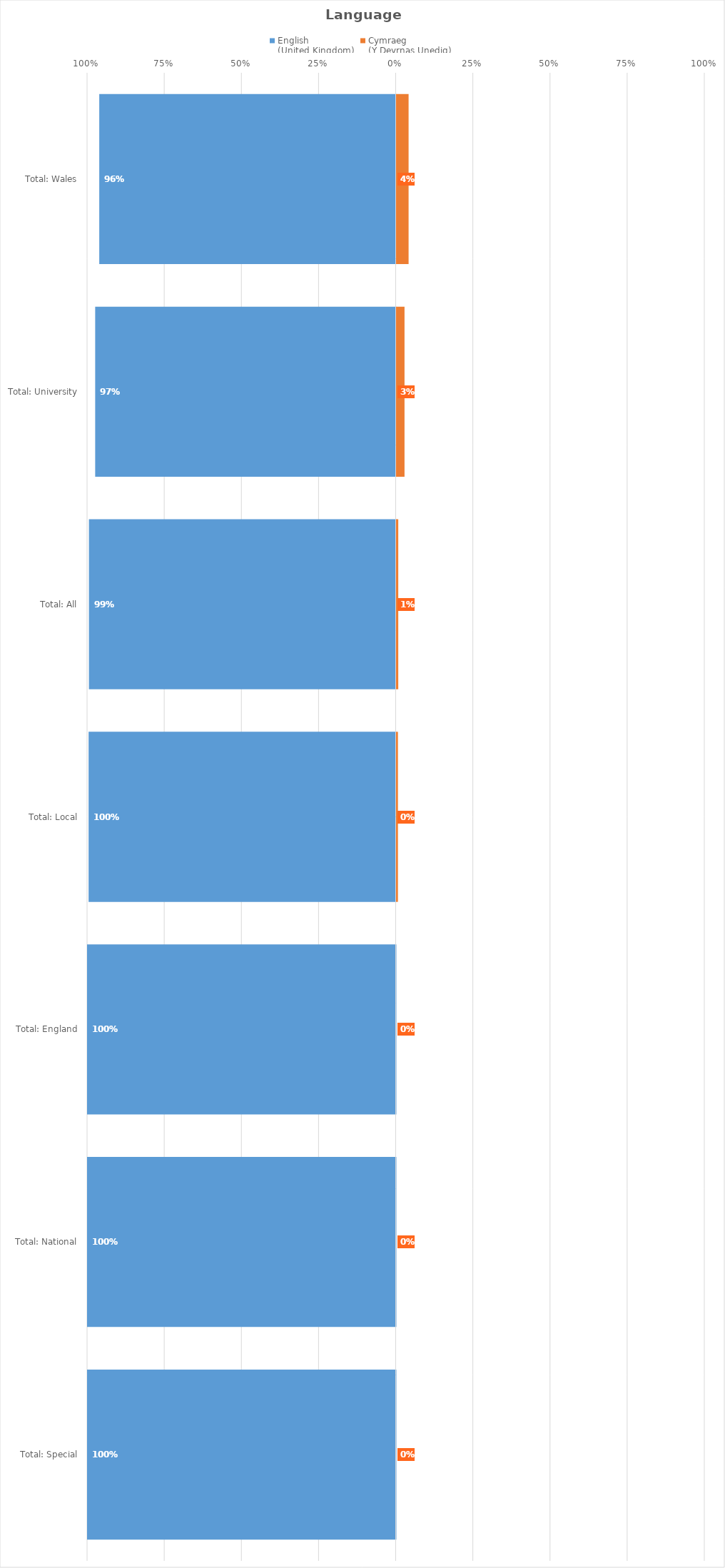
| Category | English
(United Kingdom)‎ | Cymraeg
(Y Deyrnas Unedig)‎ |
|---|---|---|
| Total: Wales | -0.96 | 0.04 |
| Total: University | -0.974 | 0.026 |
| Total: All | -0.994 | 0.006 |
| Total: Local | -0.995 | 0.005 |
| Total: England | -1 | 0 |
| Total: National | -1 | 0 |
| Total: Special | -1 | 0 |